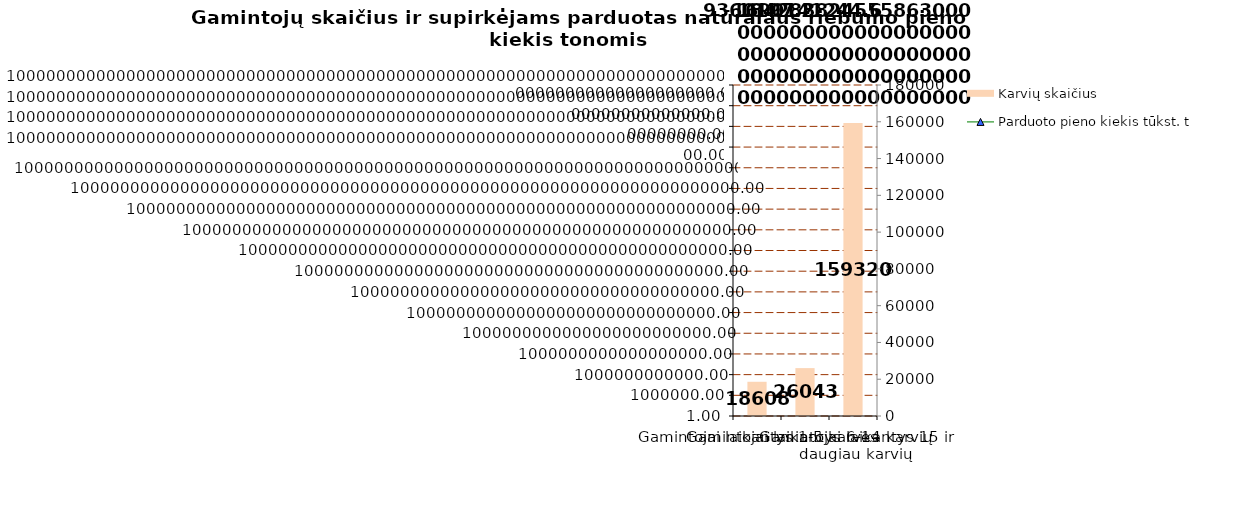
| Category | Karvių skaičius |
|---|---|
| Gamintojai laikantys 1-5 karves | 18608 |
| Gamintojai laikantys 6-14 karvių | 26043 |
| Gamintojai laikantys 15 ir daugiau karvių | 159320 |